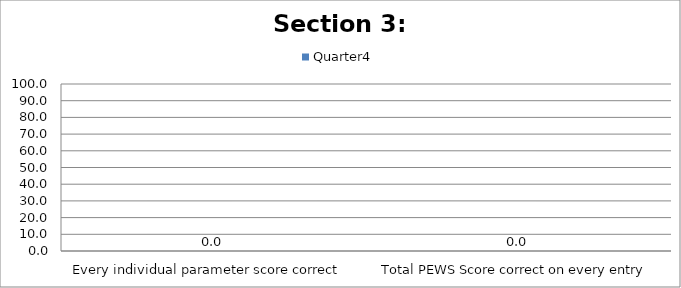
| Category | Quarter4 |
|---|---|
| Every individual parameter score correct  | 0 |
| Total PEWS Score correct on every entry | 0 |